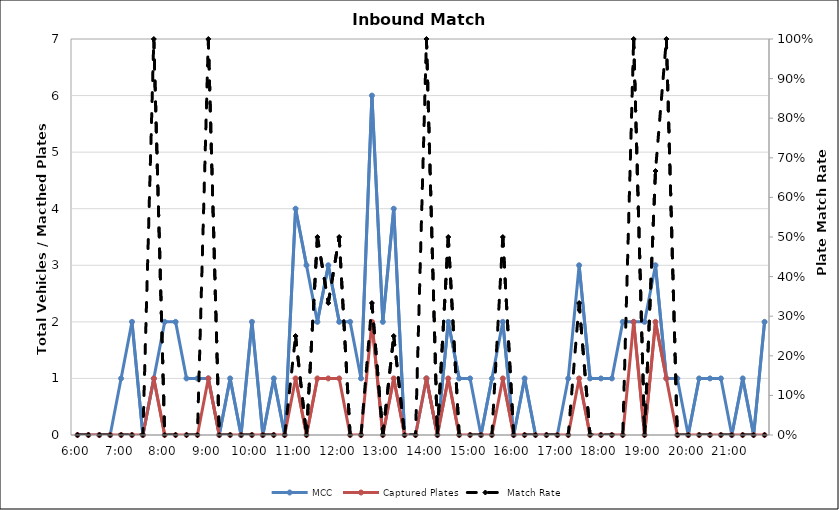
| Category | MCC | Captured Plates |
|---|---|---|
| 0.25 | 0 | 0 |
| 0.260416666666667 | 0 | 0 |
| 0.270833333333333 | 0 | 0 |
| 0.28125 | 0 | 0 |
| 0.291666666666667 | 1 | 0 |
| 0.302083333333333 | 2 | 0 |
| 0.3125 | 0 | 0 |
| 0.322916666666667 | 1 | 1 |
| 0.333333333333333 | 2 | 0 |
| 0.34375 | 2 | 0 |
| 0.354166666666667 | 1 | 0 |
| 0.364583333333333 | 1 | 0 |
| 0.375 | 1 | 1 |
| 0.385416666666667 | 0 | 0 |
| 0.395833333333333 | 1 | 0 |
| 0.40625 | 0 | 0 |
| 0.416666666666667 | 2 | 0 |
| 0.427083333333333 | 0 | 0 |
| 0.4375 | 1 | 0 |
| 0.447916666666667 | 0 | 0 |
| 0.458333333333333 | 4 | 1 |
| 0.46875 | 3 | 0 |
| 0.479166666666667 | 2 | 1 |
| 0.489583333333333 | 3 | 1 |
| 0.5 | 2 | 1 |
| 0.510416666666667 | 2 | 0 |
| 0.520833333333333 | 1 | 0 |
| 0.53125 | 6 | 2 |
| 0.541666666666667 | 2 | 0 |
| 0.552083333333333 | 4 | 1 |
| 0.5625 | 0 | 0 |
| 0.572916666666667 | 0 | 0 |
| 0.583333333333333 | 1 | 1 |
| 0.59375 | 0 | 0 |
| 0.604166666666667 | 2 | 1 |
| 0.614583333333333 | 1 | 0 |
| 0.625 | 1 | 0 |
| 0.635416666666667 | 0 | 0 |
| 0.645833333333333 | 1 | 0 |
| 0.65625 | 2 | 1 |
| 0.666666666666667 | 0 | 0 |
| 0.677083333333333 | 1 | 0 |
| 0.6875 | 0 | 0 |
| 0.697916666666667 | 0 | 0 |
| 0.708333333333333 | 0 | 0 |
| 0.71875 | 1 | 0 |
| 0.729166666666667 | 3 | 1 |
| 0.739583333333333 | 1 | 0 |
| 0.75 | 1 | 0 |
| 0.760416666666667 | 1 | 0 |
| 0.770833333333333 | 2 | 0 |
| 0.78125 | 2 | 2 |
| 0.791666666666667 | 2 | 0 |
| 0.802083333333333 | 3 | 2 |
| 0.8125 | 1 | 1 |
| 0.822916666666667 | 1 | 0 |
| 0.833333333333333 | 0 | 0 |
| 0.84375 | 1 | 0 |
| 0.854166666666667 | 1 | 0 |
| 0.864583333333333 | 1 | 0 |
| 0.875 | 0 | 0 |
| 0.885416666666667 | 1 | 0 |
| 0.895833333333333 | 0 | 0 |
| 0.90625 | 2 | 0 |